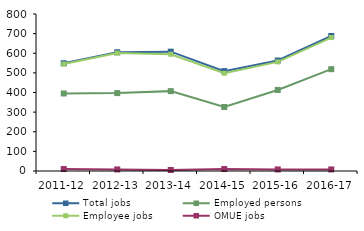
| Category | Total jobs | Employed persons | Employee jobs | OMUE jobs |
|---|---|---|---|---|
| 2011-12 | 549 | 395 | 545 | 10 |
| 2012-13 | 605 | 397 | 601 | 8 |
| 2013-14 | 608 | 407 | 595 | 5 |
| 2014-15 | 509 | 326 | 498 | 10 |
| 2015-16 | 563 | 413 | 556 | 8 |
| 2016-17 | 688 | 519 | 680 | 8 |